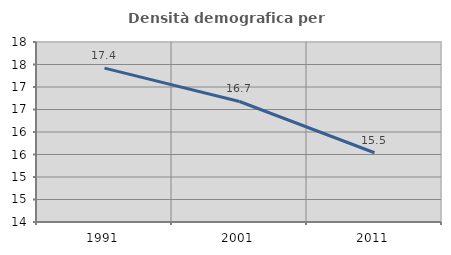
| Category | Densità demografica |
|---|---|
| 1991.0 | 17.419 |
| 2001.0 | 16.678 |
| 2011.0 | 15.539 |